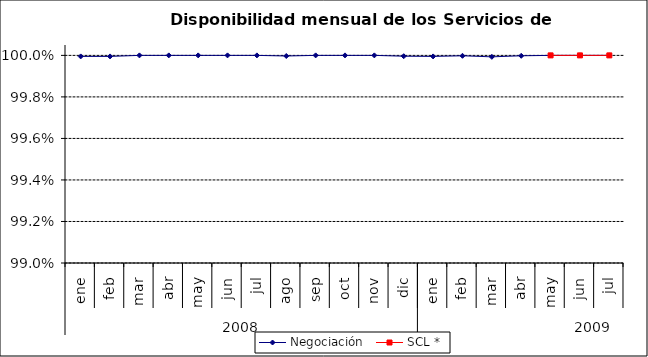
| Category | Negociación | SCL * |
|---|---|---|
| 0 | 1 | 0 |
| 1 | 1 | 0 |
| 2 | 1 | 0 |
| 3 | 1 | 0 |
| 4 | 1 | 0 |
| 5 | 1 | 0 |
| 6 | 1 | 0 |
| 7 | 1 | 0 |
| 8 | 1 | 0 |
| 9 | 1 | 0 |
| 10 | 1 | 0 |
| 11 | 1 | 0 |
| 12 | 1 | 0 |
| 13 | 1 | 0 |
| 14 | 1 | 0 |
| 15 | 1 | 0 |
| 16 | 1 | 1 |
| 17 | 1 | 1 |
| 18 | 1 | 1 |